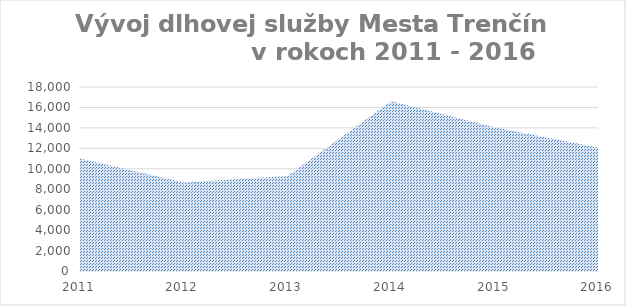
| Category | 2011 |
|---|---|
| 2011.0 | 10995 |
| 2012.0 | 8649 |
| 2013.0 | 9293 |
| 2014.0 | 16598 |
| 2015.0 | 14037 |
| 2016.0 | 12053 |